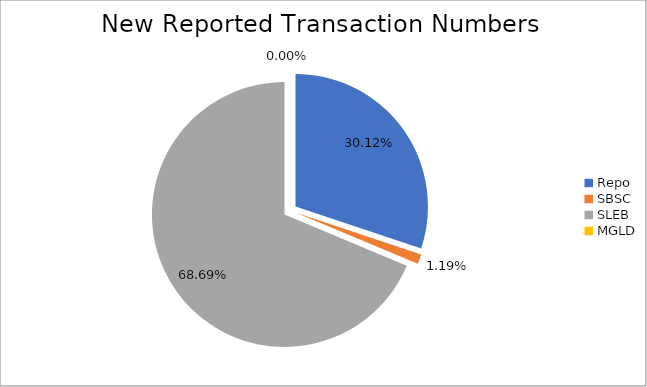
| Category | Series 0 |
|---|---|
| Repo | 321256 |
| SBSC | 12692 |
| SLEB | 732518 |
| MGLD | 16 |